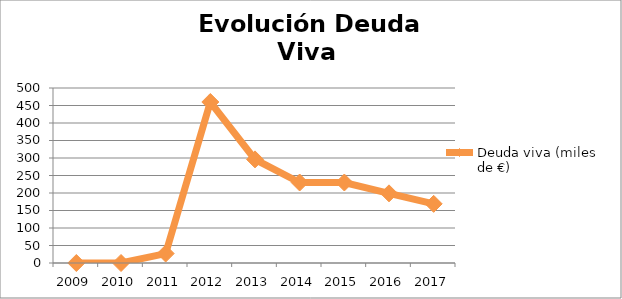
| Category | Deuda viva (miles de €) |
|---|---|
| 2009.0 | 0 |
| 2010.0 | 0 |
| 2011.0 | 27 |
| 2012.0 | 460 |
| 2013.0 | 296 |
| 2014.0 | 230 |
| 2015.0 | 230 |
| 2016.0 | 199 |
| 2017.0 | 169 |